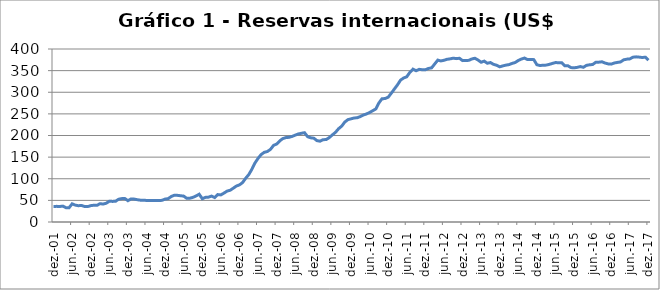
| Category | Reservas internacionais |
|---|---|
| 2001-12-01 | 35.866 |
| 2002-01-01 | 36.167 |
| 2002-02-01 | 35.906 |
| 2002-03-01 | 36.721 |
| 2002-04-01 | 33.008 |
| 2002-05-01 | 32.889 |
| 2002-06-01 | 41.999 |
| 2002-07-01 | 39.06 |
| 2002-08-01 | 37.643 |
| 2002-09-01 | 38.381 |
| 2002-10-01 | 35.855 |
| 2002-11-01 | 35.592 |
| 2002-12-01 | 37.823 |
| 2003-01-01 | 38.772 |
| 2003-02-01 | 38.53 |
| 2003-03-01 | 42.335 |
| 2003-04-01 | 41.5 |
| 2003-05-01 | 43.373 |
| 2003-06-01 | 47.956 |
| 2003-07-01 | 47.645 |
| 2003-08-01 | 47.793 |
| 2003-09-01 | 52.675 |
| 2003-10-01 | 54.093 |
| 2003-11-01 | 54.427 |
| 2003-12-01 | 49.296 |
| 2004-01-01 | 53.261 |
| 2004-02-01 | 52.96 |
| 2004-03-01 | 51.612 |
| 2004-04-01 | 50.498 |
| 2004-05-01 | 50.54 |
| 2004-06-01 | 49.805 |
| 2004-07-01 | 49.666 |
| 2004-08-01 | 49.594 |
| 2004-09-01 | 49.496 |
| 2004-10-01 | 49.416 |
| 2004-11-01 | 50.133 |
| 2004-12-01 | 52.935 |
| 2005-01-01 | 54.022 |
| 2005-02-01 | 59.017 |
| 2005-03-01 | 61.96 |
| 2005-04-01 | 61.591 |
| 2005-05-01 | 60.709 |
| 2005-06-01 | 59.885 |
| 2005-07-01 | 54.688 |
| 2005-08-01 | 55.076 |
| 2005-09-01 | 57.008 |
| 2005-10-01 | 60.245 |
| 2005-11-01 | 64.277 |
| 2005-12-01 | 53.799 |
| 2006-01-01 | 56.924 |
| 2006-02-01 | 57.415 |
| 2006-03-01 | 59.824 |
| 2006-04-01 | 56.552 |
| 2006-05-01 | 63.381 |
| 2006-06-01 | 62.67 |
| 2006-07-01 | 66.819 |
| 2006-08-01 | 71.478 |
| 2006-09-01 | 73.393 |
| 2006-10-01 | 78.171 |
| 2006-11-01 | 83.114 |
| 2006-12-01 | 85.839 |
| 2007-01-01 | 91.086 |
| 2007-02-01 | 101.07 |
| 2007-03-01 | 109.531 |
| 2007-04-01 | 121.83 |
| 2007-05-01 | 136.419 |
| 2007-06-01 | 147.101 |
| 2007-07-01 | 155.91 |
| 2007-08-01 | 161.097 |
| 2007-09-01 | 162.962 |
| 2007-10-01 | 167.867 |
| 2007-11-01 | 177.06 |
| 2007-12-01 | 180.334 |
| 2008-01-01 | 187.507 |
| 2008-02-01 | 192.902 |
| 2008-03-01 | 195.232 |
| 2008-04-01 | 195.767 |
| 2008-05-01 | 197.906 |
| 2008-06-01 | 200.827 |
| 2008-07-01 | 203.562 |
| 2008-08-01 | 205.116 |
| 2008-09-01 | 206.494 |
| 2008-10-01 | 197.229 |
| 2008-11-01 | 194.668 |
| 2008-12-01 | 193.783 |
| 2009-01-01 | 188.102 |
| 2009-02-01 | 186.88 |
| 2009-03-01 | 190.388 |
| 2009-04-01 | 190.546 |
| 2009-05-01 | 195.264 |
| 2009-06-01 | 201.467 |
| 2009-07-01 | 207.363 |
| 2009-08-01 | 215.744 |
| 2009-09-01 | 221.629 |
| 2009-10-01 | 231.123 |
| 2009-11-01 | 236.66 |
| 2009-12-01 | 238.52 |
| 2010-01-01 | 240.484 |
| 2010-02-01 | 241.082 |
| 2010-03-01 | 243.762 |
| 2010-04-01 | 247.292 |
| 2010-05-01 | 249.846 |
| 2010-06-01 | 253.114 |
| 2010-07-01 | 257.299 |
| 2010-08-01 | 261.32 |
| 2010-09-01 | 275.206 |
| 2010-10-01 | 284.93 |
| 2010-11-01 | 285.461 |
| 2010-12-01 | 288.575 |
| 2011-01-01 | 297.696 |
| 2011-02-01 | 307.516 |
| 2011-03-01 | 317.146 |
| 2011-04-01 | 328.062 |
| 2011-05-01 | 333.017 |
| 2011-06-01 | 335.775 |
| 2011-07-01 | 346.144 |
| 2011-08-01 | 353.397 |
| 2011-09-01 | 349.708 |
| 2011-10-01 | 352.928 |
| 2011-11-01 | 352.073 |
| 2011-12-01 | 352.012 |
| 2012-01-01 | 355.075 |
| 2012-02-01 | 356.33 |
| 2012-03-01 | 365.216 |
| 2012-04-01 | 374.272 |
| 2012-05-01 | 372.409 |
| 2012-06-01 | 373.91 |
| 2012-07-01 | 376.154 |
| 2012-08-01 | 377.221 |
| 2012-09-01 | 378.726 |
| 2012-10-01 | 377.753 |
| 2012-11-01 | 378.56 |
| 2012-12-01 | 373.147 |
| 2013-01-01 | 373.417 |
| 2013-02-01 | 373.742 |
| 2013-03-01 | 376.934 |
| 2013-04-01 | 378.665 |
| 2013-05-01 | 374.417 |
| 2013-06-01 | 369.402 |
| 2013-07-01 | 371.966 |
| 2013-08-01 | 367.002 |
| 2013-09-01 | 368.654 |
| 2013-10-01 | 364.505 |
| 2013-11-01 | 362.41 |
| 2013-12-01 | 358.808 |
| 2014-01-01 | 360.936 |
| 2014-02-01 | 362.691 |
| 2014-03-01 | 363.914 |
| 2014-04-01 | 366.717 |
| 2014-05-01 | 368.752 |
| 2014-06-01 | 373.516 |
| 2014-07-01 | 376.792 |
| 2014-08-01 | 379.157 |
| 2014-09-01 | 375.513 |
| 2014-10-01 | 375.833 |
| 2014-11-01 | 375.426 |
| 2014-12-01 | 363.551 |
| 2015-01-01 | 361.767 |
| 2015-02-01 | 362.547 |
| 2015-03-01 | 362.744 |
| 2015-04-01 | 364.473 |
| 2015-05-01 | 366.647 |
| 2015-06-01 | 368.668 |
| 2015-07-01 | 368.252 |
| 2015-08-01 | 368.159 |
| 2015-09-01 | 361.37 |
| 2015-10-01 | 361.23 |
| 2015-11-01 | 357.016 |
| 2015-12-01 | 356.464 |
| 2016-01-01 | 357.507 |
| 2016-02-01 | 359.368 |
| 2016-03-01 | 357.698 |
| 2016-04-01 | 362.201 |
| 2016-05-01 | 363.447 |
| 2016-06-01 | 364.152 |
| 2016-07-01 | 369.34 |
| 2016-08-01 | 369.541 |
| 2016-09-01 | 370.417 |
| 2016-10-01 | 367.528 |
| 2016-11-01 | 365.556 |
| 2016-12-01 | 365.016 |
| 2017-01-01 | 367.708 |
| 2017-02-01 | 368.981 |
| 2017-03-01 | 370.111 |
| 2017-04-01 | 374.945 |
| 2017-05-01 | 376.491 |
| 2017-06-01 | 377.175 |
| 2017-07-01 | 381.029 |
| 2017-08-01 | 381.843 |
| 2017-09-01 | 381.244 |
| 2017-10-01 | 380.351 |
| 2017-11-01 | 381.056 |
| 2017-12-01 | 373.972 |